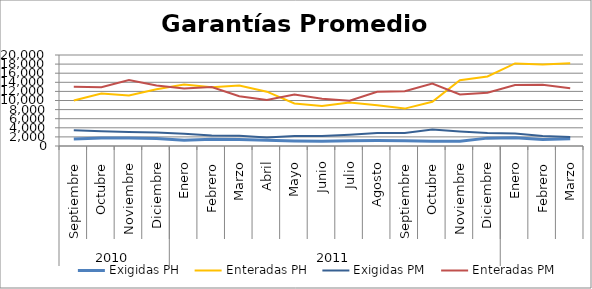
| Category | Exigidas PH | Enteradas PH | Exigidas PM | Enteradas PM |
|---|---|---|---|---|
| 0 | 1528.048 | 9989.528 | 3482.397 | 13040.893 |
| 1 | 1765.671 | 11522.563 | 3249.678 | 12931.878 |
| 2 | 1744.818 | 11123.372 | 3083.204 | 14519.409 |
| 3 | 1659.203 | 12493.623 | 2971.808 | 13273.812 |
| 4 | 1282.931 | 13511.197 | 2715.795 | 12631.271 |
| 5 | 1469.886 | 12912.935 | 2313.398 | 12967.84 |
| 6 | 1451.049 | 13292.147 | 2234.5 | 10944.124 |
| 7 | 1243.266 | 11940.059 | 1876.192 | 10106.188 |
| 8 | 1094.477 | 9346.935 | 2211.516 | 11309.35 |
| 9 | 1038.181 | 8772.488 | 2185.859 | 10360.845 |
| 10 | 1150.33 | 9583.522 | 2484.933 | 9954.534 |
| 11 | 1204.945 | 8947.225 | 2874.347 | 11912.953 |
| 12 | 1181.135 | 8218.837 | 2868.226 | 12046.458 |
| 13 | 1047.181 | 9725.758 | 3619.145 | 13704.352 |
| 14 | 1067.214 | 14456.861 | 3177.175 | 11327.495 |
| 15 | 1729.716 | 15271.717 | 2830.669 | 11719.895 |
| 16 | 1828.564 | 18155.583 | 2744.93 | 13413.991 |
| 17 | 1451.155 | 17917.734 | 2215.902 | 13440.832 |
| 18 | 1587.31 | 18166.129 | 1968.766 | 12673.714 |